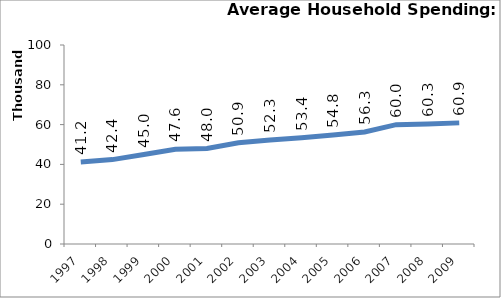
| Category | Average Household Spending 2009 |
|---|---|
| 1997.0 | 41180 |
| 1998.0 | 42407 |
| 1999.0 | 44964 |
| 2000.0 | 47594 |
| 2001.0 | 47959 |
| 2002.0 | 50876 |
| 2003.0 | 52268 |
| 2004.0 | 53374 |
| 2005.0 | 54800 |
| 2006.0 | 56319 |
| 2007.0 | 59987 |
| 2008.0 | 60328 |
| 2009.0 | 60867 |